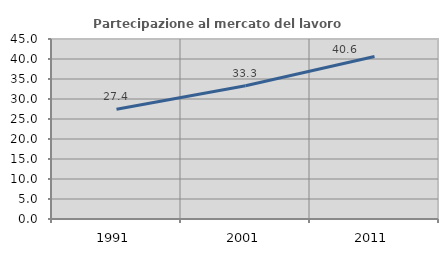
| Category | Partecipazione al mercato del lavoro  femminile |
|---|---|
| 1991.0 | 27.442 |
| 2001.0 | 33.333 |
| 2011.0 | 40.625 |